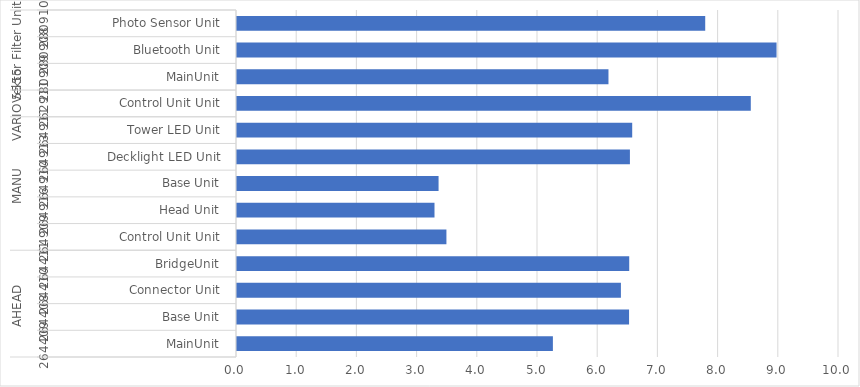
| Category | Stock Range [Mt] |
|---|---|
| 0 | 5.247 |
| 1 | 6.513 |
| 2 | 6.377 |
| 3 | 6.515 |
| 4 | 3.479 |
| 5 | 3.281 |
| 6 | 3.348 |
| 7 | 6.527 |
| 8 | 6.565 |
| 9 | 8.535 |
| 10 | 6.171 |
| 11 | 8.962 |
| 12 | 7.778 |